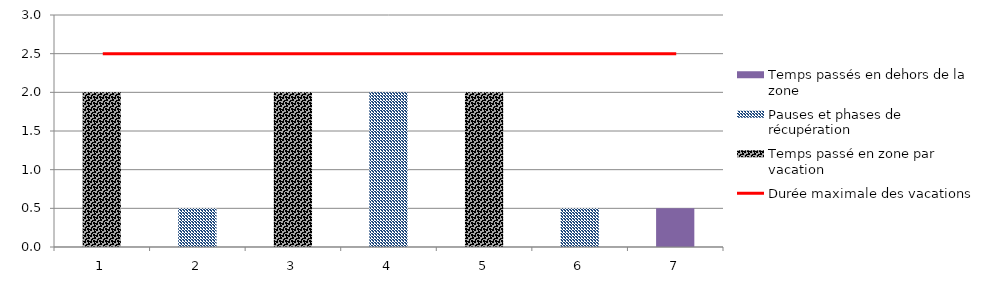
| Category | Temps passé en zone par vacation | Pauses et phases de récupération | Temps passés en dehors de la zone |
|---|---|---|---|
| 0 | 2 | 0 | 0 |
| 1 | 0 | 0.5 | 0 |
| 2 | 2 | 0 | 0 |
| 3 | 0 | 2 | 0 |
| 4 | 2 | 0 | 0 |
| 5 | 0 | 0.5 | 0 |
| 6 | 0 | 0 | 0.5 |